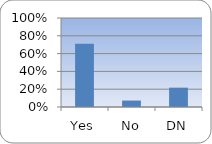
| Category | Series 0 |
|---|---|
| Yes | 0.71 |
| No | 0.072 |
| DN | 0.217 |